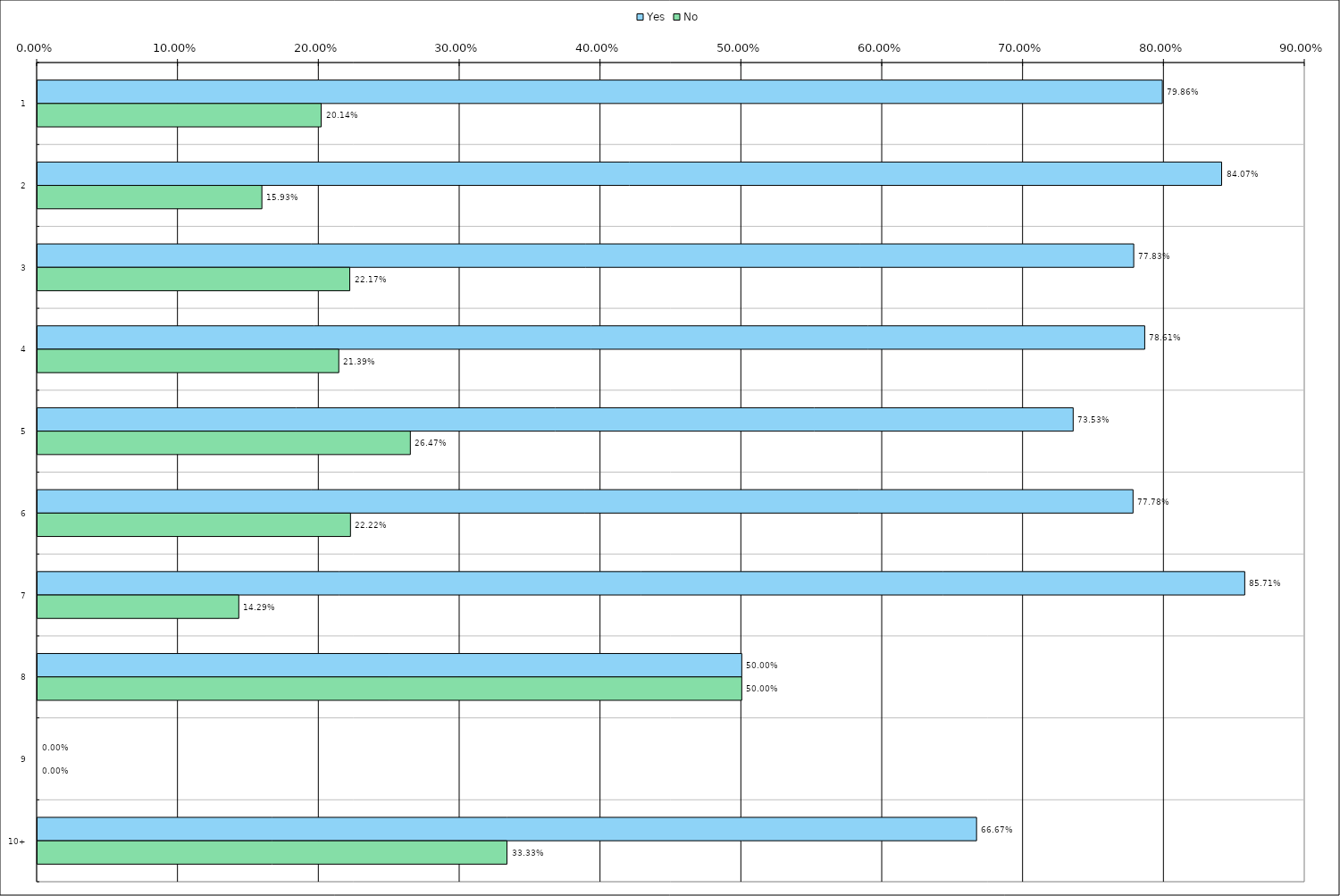
| Category | Yes | No |
|---|---|---|
| 0 | 0.799 | 0.201 |
| 1 | 0.841 | 0.159 |
| 2 | 0.778 | 0.222 |
| 3 | 0.786 | 0.214 |
| 4 | 0.735 | 0.265 |
| 5 | 0.778 | 0.222 |
| 6 | 0.857 | 0.143 |
| 7 | 0.5 | 0.5 |
| 8 | 0 | 0 |
| 9 | 0.667 | 0.333 |